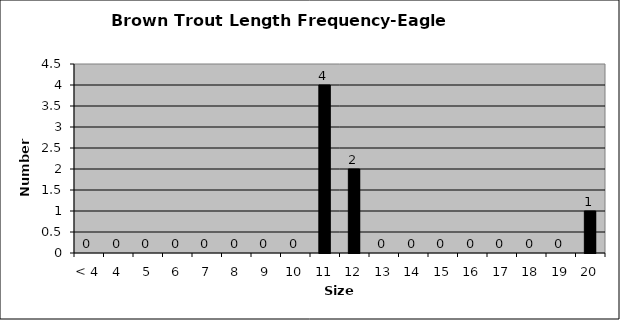
| Category | Series 0 |
|---|---|
| < 4 | 0 |
| 4 | 0 |
| 5 | 0 |
| 6 | 0 |
| 7 | 0 |
| 8 | 0 |
| 9 | 0 |
| 10 | 0 |
| 11 | 4 |
| 12 | 2 |
| 13 | 0 |
| 14 | 0 |
| 15 | 0 |
| 16 | 0 |
| 17 | 0 |
| 18 | 0 |
| 19 | 0 |
| 20 | 1 |